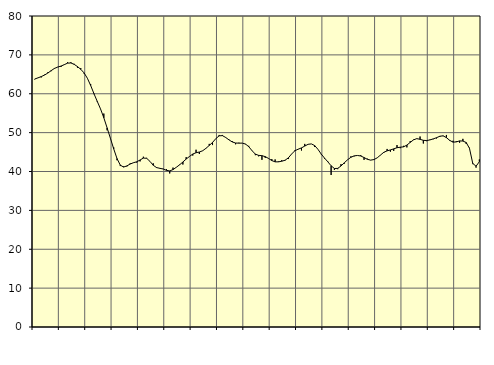
| Category | Piggar | Series 1 |
|---|---|---|
| nan | 63.7 | 63.79 |
| 87.0 | 64.1 | 64.08 |
| 87.0 | 64.2 | 64.42 |
| 87.0 | 64.9 | 64.81 |
| nan | 65.5 | 65.32 |
| 88.0 | 65.8 | 65.94 |
| 88.0 | 66.6 | 66.51 |
| 88.0 | 66.9 | 66.86 |
| nan | 66.9 | 67.12 |
| 89.0 | 67.4 | 67.48 |
| 89.0 | 68.1 | 67.87 |
| 89.0 | 68.1 | 67.92 |
| nan | 67.7 | 67.56 |
| 90.0 | 66.7 | 66.99 |
| 90.0 | 66.6 | 66.29 |
| 90.0 | 65.2 | 65.37 |
| nan | 64 | 64 |
| 91.0 | 62.5 | 62.14 |
| 91.0 | 59.9 | 60.03 |
| 91.0 | 57.9 | 58.04 |
| nan | 56.1 | 56.1 |
| 92.0 | 54.9 | 53.82 |
| 92.0 | 50.6 | 51.22 |
| 92.0 | 48.6 | 48.54 |
| nan | 46.2 | 45.82 |
| 93.0 | 42.9 | 43.33 |
| 93.0 | 41.4 | 41.64 |
| 93.0 | 41.3 | 41.14 |
| nan | 41.3 | 41.44 |
| 94.0 | 42.1 | 41.92 |
| 94.0 | 42.3 | 42.26 |
| 94.0 | 42.3 | 42.5 |
| nan | 42.6 | 42.96 |
| 95.0 | 43.8 | 43.45 |
| 95.0 | 43.5 | 43.4 |
| 95.0 | 42.6 | 42.61 |
| nan | 42.1 | 41.6 |
| 96.0 | 40.9 | 41.01 |
| 96.0 | 40.9 | 40.82 |
| 96.0 | 40.7 | 40.64 |
| nan | 40.6 | 40.3 |
| 97.0 | 39.5 | 40.15 |
| 97.0 | 41 | 40.49 |
| 97.0 | 41.1 | 41.08 |
| nan | 41.8 | 41.72 |
| 98.0 | 41.8 | 42.44 |
| 98.0 | 43.7 | 43.2 |
| 98.0 | 43.8 | 43.87 |
| nan | 44.1 | 44.49 |
| 99.0 | 45.6 | 44.83 |
| 99.0 | 44.5 | 45.01 |
| 99.0 | 45.3 | 45.33 |
| nan | 46 | 45.96 |
| 0.0 | 47.1 | 46.7 |
| 0.0 | 46.8 | 47.47 |
| 0.0 | 48.5 | 48.45 |
| nan | 49.4 | 49.17 |
| 1.0 | 49.4 | 49.23 |
| 1.0 | 48.8 | 48.75 |
| 1.0 | 48.2 | 48.13 |
| nan | 47.8 | 47.6 |
| 2.0 | 47 | 47.33 |
| 2.0 | 47.4 | 47.29 |
| 2.0 | 47.3 | 47.3 |
| nan | 47 | 47.07 |
| 3.0 | 46.6 | 46.38 |
| 3.0 | 45.3 | 45.35 |
| 3.0 | 44.2 | 44.47 |
| nan | 43.9 | 44.15 |
| 4.0 | 43 | 44.07 |
| 4.0 | 43.5 | 43.83 |
| 4.0 | 43.4 | 43.36 |
| nan | 43.2 | 42.81 |
| 5.0 | 43.1 | 42.48 |
| 5.0 | 42.6 | 42.48 |
| 5.0 | 42.9 | 42.64 |
| nan | 42.8 | 42.89 |
| 6.0 | 43.2 | 43.49 |
| 6.0 | 44.5 | 44.49 |
| 6.0 | 45.5 | 45.34 |
| nan | 45.7 | 45.74 |
| 7.0 | 45.4 | 46.07 |
| 7.0 | 47.1 | 46.54 |
| 7.0 | 47 | 46.99 |
| nan | 47.1 | 47.1 |
| 8.0 | 46.3 | 46.68 |
| 8.0 | 45.7 | 45.71 |
| 8.0 | 44.4 | 44.48 |
| nan | 43.3 | 43.45 |
| 9.0 | 42.6 | 42.49 |
| 9.0 | 39.1 | 41.47 |
| 9.0 | 40.4 | 40.77 |
| nan | 40.6 | 40.8 |
| 10.0 | 41.9 | 41.42 |
| 10.0 | 42 | 42.24 |
| 10.0 | 43 | 43.02 |
| nan | 43.9 | 43.65 |
| 11.0 | 43.9 | 44.02 |
| 11.0 | 44.1 | 44.12 |
| 11.0 | 44.2 | 43.99 |
| nan | 43 | 43.59 |
| 12.0 | 43.3 | 43.14 |
| 12.0 | 42.9 | 42.93 |
| 12.0 | 43 | 43.07 |
| nan | 43.5 | 43.52 |
| 13.0 | 44.2 | 44.24 |
| 13.0 | 44.8 | 44.94 |
| 13.0 | 45.8 | 45.31 |
| nan | 45.1 | 45.55 |
| 14.0 | 45.3 | 45.82 |
| 14.0 | 46.8 | 46.12 |
| 14.0 | 46 | 46.25 |
| nan | 46.6 | 46.35 |
| 15.0 | 46.2 | 46.79 |
| 15.0 | 47.8 | 47.48 |
| 15.0 | 48.2 | 48.13 |
| nan | 48.4 | 48.45 |
| 16.0 | 49 | 48.28 |
| 16.0 | 47.2 | 48.02 |
| 16.0 | 47.8 | 47.96 |
| nan | 48.2 | 48.12 |
| 17.0 | 48.3 | 48.39 |
| 17.0 | 48.5 | 48.69 |
| 17.0 | 48.9 | 49.07 |
| nan | 49.1 | 49.18 |
| 18.0 | 49.4 | 48.71 |
| 18.0 | 47.9 | 48.01 |
| 18.0 | 47.9 | 47.55 |
| nan | 47.8 | 47.61 |
| 19.0 | 47.4 | 47.87 |
| 19.0 | 48.4 | 47.83 |
| 19.0 | 47.1 | 47.46 |
| nan | 46.1 | 45.96 |
| 20.0 | 41.9 | 42.08 |
| 20.0 | 41 | 41.36 |
| 20.0 | 43.1 | 42.52 |